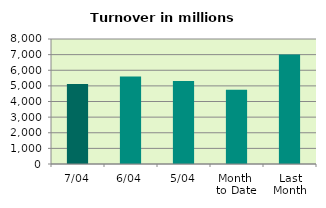
| Category | Series 0 |
|---|---|
| 7/04 | 5115.615 |
| 6/04 | 5598.409 |
| 5/04 | 5314.13 |
| Month 
to Date | 4748.828 |
| Last
Month | 7002.451 |